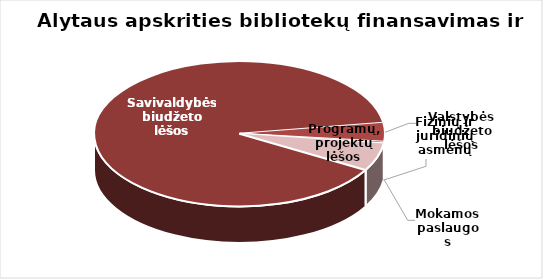
| Category | Series 0 |
|---|---|
| Savivaldybės biudžeto lėšos | 2497854.64 |
| Valstybės biudžeto lėšos | 116992 |
| Mokamos paslaugos | 10598.17 |
| Fizinių ir juridinių asmenų parama | 34.98 |
| Programų, projektų lėšos | 172750.89 |